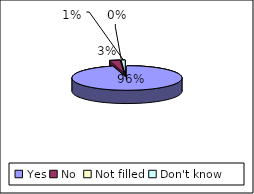
| Category | During your initial consultation with the doctor were you given information about the procedure he was planning to carry out |
|---|---|
| Yes | 93 |
| No  | 3 |
| Not filled | 0 |
| Don't know  | 1 |